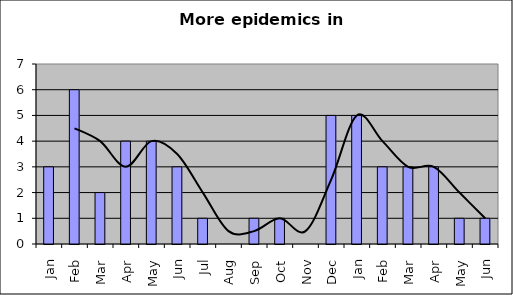
| Category | Series 0 |
|---|---|
| Jan | 3 |
| Feb | 6 |
| Mar | 2 |
| Apr | 4 |
| May | 4 |
| Jun | 3 |
| Jul | 1 |
| Aug | 0 |
| Sep | 1 |
| Oct | 1 |
| Nov | 0 |
| Dec | 5 |
| Jan | 5 |
| Feb | 3 |
| Mar | 3 |
| Apr | 3 |
| May | 1 |
| Jun | 1 |